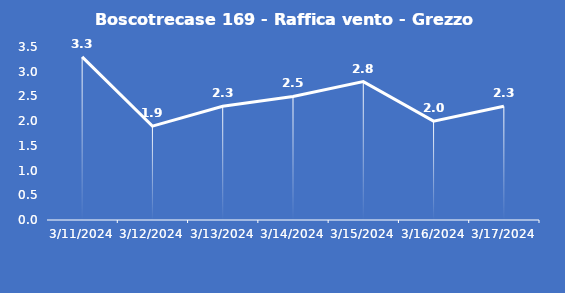
| Category | Boscotrecase 169 - Raffica vento - Grezzo (m/s) |
|---|---|
| 3/11/24 | 3.3 |
| 3/12/24 | 1.9 |
| 3/13/24 | 2.3 |
| 3/14/24 | 2.5 |
| 3/15/24 | 2.8 |
| 3/16/24 | 2 |
| 3/17/24 | 2.3 |